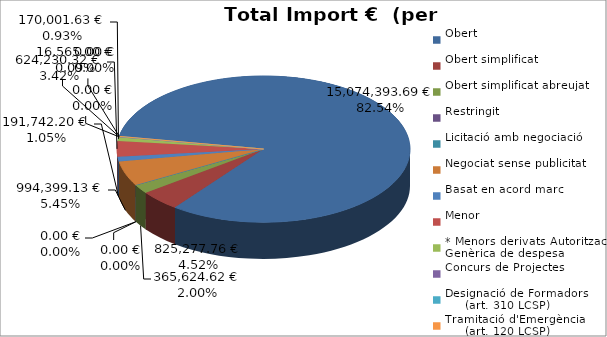
| Category | Total preu
(amb IVA) |
|---|---|
| Obert | 15074393.69 |
| Obert simplificat | 825277.76 |
| Obert simplificat abreujat | 365624.62 |
| Restringit | 0 |
| Licitació amb negociació | 0 |
| Negociat sense publicitat | 994399.13 |
| Basat en acord marc | 191742.2 |
| Menor | 624230.32 |
| * Menors derivats Autorització Genèrica de despesa | 170001.63 |
| Concurs de Projectes | 0 |
| Designació de Formadors
     (art. 310 LCSP) | 16565 |
| Tramitació d'Emergència
     (art. 120 LCSP) | 0 |